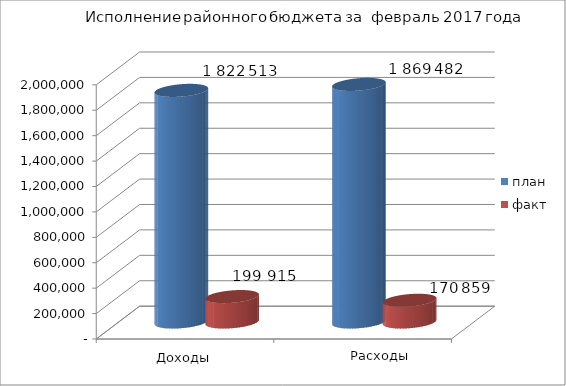
| Category | план | факт |
|---|---|---|
| 0 | 1822513 | 199914 |
| 1 | 1869482 | 170859 |